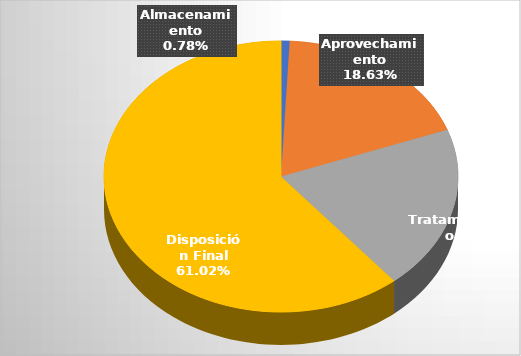
| Category | Series 0 |
|---|---|
| Almacenamiento | 134934.94 |
| Aprovechamiento | 3225967.18 |
| Tratamiento | 3388808.04 |
| Disposición Final | 10567984.91 |